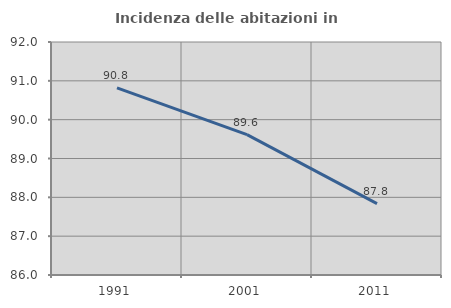
| Category | Incidenza delle abitazioni in proprietà  |
|---|---|
| 1991.0 | 90.82 |
| 2001.0 | 89.614 |
| 2011.0 | 87.838 |